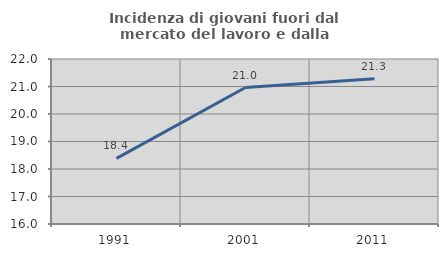
| Category | Incidenza di giovani fuori dal mercato del lavoro e dalla formazione  |
|---|---|
| 1991.0 | 18.384 |
| 2001.0 | 20.962 |
| 2011.0 | 21.279 |